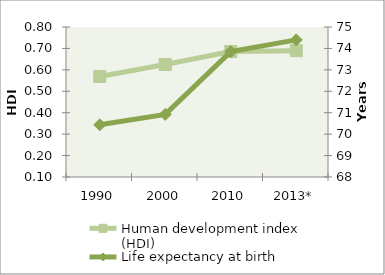
| Category | Human development index (HDI) |
|---|---|
| 1990 | 0.569 |
| 2000 | 0.625 |
| 2010 | 0.686 |
| 2013* | 0.69 |